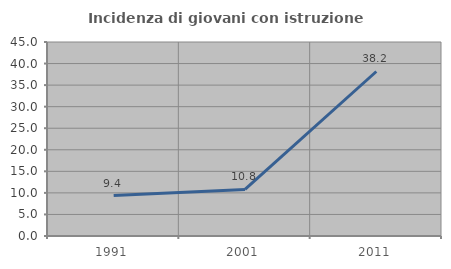
| Category | Incidenza di giovani con istruzione universitaria |
|---|---|
| 1991.0 | 9.375 |
| 2001.0 | 10.811 |
| 2011.0 | 38.158 |